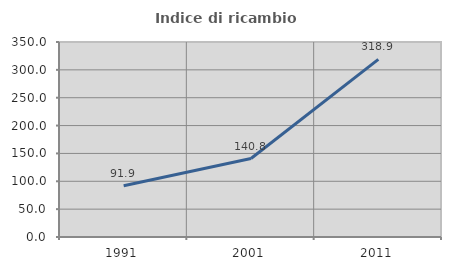
| Category | Indice di ricambio occupazionale  |
|---|---|
| 1991.0 | 91.867 |
| 2001.0 | 140.826 |
| 2011.0 | 318.919 |